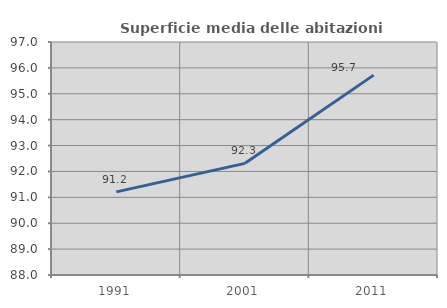
| Category | Superficie media delle abitazioni occupate |
|---|---|
| 1991.0 | 91.212 |
| 2001.0 | 92.313 |
| 2011.0 | 95.721 |